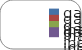
| Category | Series 0 |
|---|---|
| galina.clabuckova@yandex.ru | 0 |
| galina.clabuckova@yandex.ru | 0 |
| galina.clabuckova@yandex.ru | 0 |
| galina.clabuckova@yandex.ru | 0 |
| galina.clabuckova@yandex.ru | 0 |
| galina.clabuckova@yandex.ru | 0 |
| galina.clabuckova@yandex.ru | 0 |
| galina.clabuckova@yandex.ru | 0 |
| galina.clabuckova@yandex.ru | 0 |
| galina.clabuckova@yandex.ru | 0 |